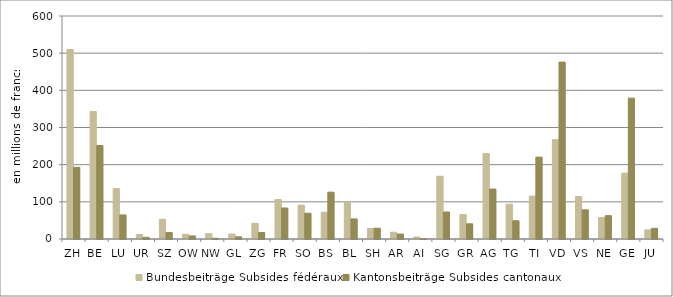
| Category | Bundesbeiträge | Kantonsbeiträge |
|---|---|---|
| ZH | 509.829 | 192.967 |
| BE | 342.716 | 251.532 |
| LU | 135.691 | 64.743 |
| UR | 12.044 | 4.548 |
| SZ | 52.982 | 17.282 |
| OW | 12.453 | 8.28 |
| NW | 14.257 | 1.881 |
| GL | 13.346 | 5.787 |
| ZG | 42.05 | 17.47 |
| FR | 106.29 | 83.429 |
| SO | 91.056 | 69.321 |
| BS | 72.113 | 126.07 |
| BL | 99.357 | 54.033 |
| SH | 28.389 | 28.969 |
| AR | 18.209 | 13.412 |
| AI | 5.338 | 0.917 |
| SG | 168.917 | 72.681 |
| GR | 65.606 | 40.833 |
| AG | 229.806 | 134.474 |
| TG | 93.649 | 49.14 |
| TI | 115.482 | 220.332 |
| VD | 267.189 | 475.996 |
| VS | 114.27 | 78.459 |
| NE | 57.948 | 62.742 |
| GE | 177.252 | 378.948 |
| JU | 24.464 | 28.693 |